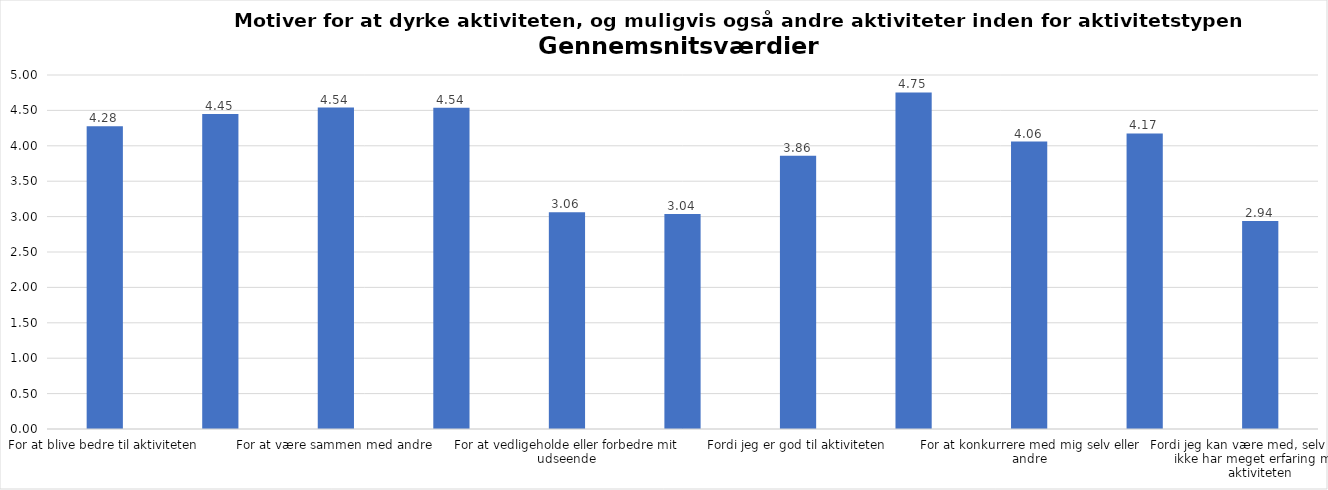
| Category | Gennemsnit |
|---|---|
| For at blive bedre til aktiviteten | 4.277 |
| For at vedligeholde eller forbedre min sundhed (fx helbred, fysisk form) | 4.449 |
| For at være sammen med andre | 4.54 |
| For at gøre noget godt for mig selv | 4.538 |
| For at vedligeholde eller forbedre mit udseende | 3.061 |
| Fordi andre i min omgangskreds opmuntrer mig til det | 3.038 |
| Fordi jeg er god til aktiviteten | 3.859 |
| Fordi jeg godt kan lide aktiviteten | 4.754 |
| For at konkurrere med mig selv eller andre | 4.06 |
| Fordi aktiviteten passer godt ind i min hverdag | 4.174 |
| Fordi jeg kan være med, selv om jeg ikke har meget erfaring med aktiviteten | 2.939 |